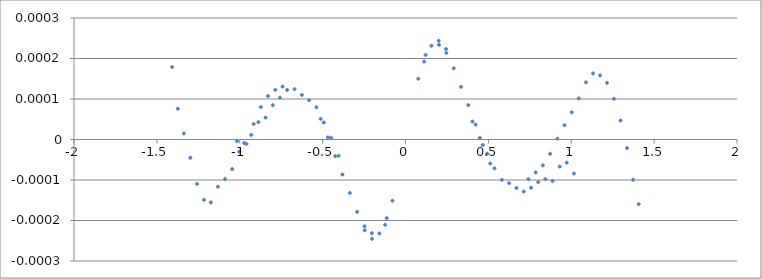
| Category | Series 0 |
|---|---|
| 1.406968 | 0 |
| 1.373006 | 0 |
| 1.336391 | 0 |
| 1.297589 | 0 |
| 1.257222 | 0 |
| 1.215843 | 0 |
| 1.173861 | 0 |
| 1.131479 | 0 |
| 1.088804 | 0 |
| 1.045918 | 0 |
| 1.002823 | 0 |
| 0.959581 | 0 |
| 0.916209 | 0 |
| 0.87272 | 0 |
| 0.829122 | 0 |
| 0.785379 | 0 |
| 0.741527 | 0 |
| -1.407642 | 0 |
| -1.373557 | 0 |
| -1.336845 | 0 |
| -1.297966 | 0 |
| -1.257536 | 0 |
| -1.216107 | 0 |
| -1.174085 | 0 |
| -1.13167 | 0 |
| -1.088966 | 0 |
| -1.046054 | 0 |
| -1.002936 | 0 |
| -0.959673 | 0 |
| -0.916281 | 0 |
| -0.872774 | 0 |
| -0.829159 | 0 |
| -0.785401 | 0 |
| -0.741536 | 0 |
| 1.016165 | 0 |
| 0.972952 | 0 |
| 0.930159 | 0 |
| 0.887199 | 0 |
| 0.84399 | 0 |
| 0.80061 | 0 |
| 0.757055 | 0 |
| 0.713323 | 0 |
| 0.669466 | 0 |
| 0.625449 | 0 |
| 0.581338 | 0 |
| 0.537125 | 0 |
| 0.492797 | 0 |
| 0.448408 | 0 |
| 0.40391 | 0 |
| -1.016338 | 0 |
| -0.973134 | 0 |
| -0.930356 | 0 |
| -0.887404 | 0 |
| -0.844199 | 0 |
| -0.800818 | 0 |
| -0.75726 | 0 |
| -0.713522 | 0 |
| -0.669656 | 0 |
| -0.625629 | 0 |
| -0.581507 | 0 |
| -0.537284 | 0 |
| -0.492944 | 0 |
| -0.448545 | 0 |
| -0.404037 | 0 |
| 0.510957 | 0 |
| 0.4667 | 0 |
| 0.422983 | 0 |
| 0.379145 | 0 |
| 0.335138 | 0 |
| 0.290971 | 0 |
| 0.246671 | 0 |
| 0.202252 | 0 |
| -0.512125 | 0 |
| -0.467913 | 0 |
| -0.424168 | 0 |
| -0.380261 | 0 |
| -0.336171 | 0 |
| -0.291915 | 0 |
| -0.247524 | 0 |
| -0.203025 | 0 |
| 0.24451 | 0 |
| 0.20031 | 0 |
| 0.156426 | 0 |
| 0.112313 | 0 |
| -0.246001 | 0 |
| -0.20176 | 0 |
| -0.157721 | 0 |
| -0.113456 | 0 |
| 0.121464 | 0 |
| 0.077448 | 0 |
| -0.123135 | 0 |
| -0.078911 | 0 |